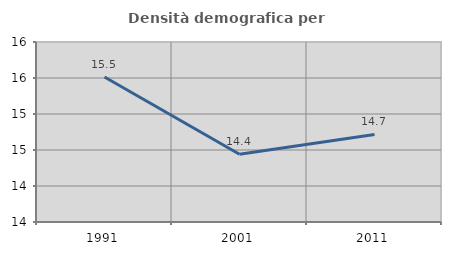
| Category | Densità demografica |
|---|---|
| 1991.0 | 15.514 |
| 2001.0 | 14.442 |
| 2011.0 | 14.716 |